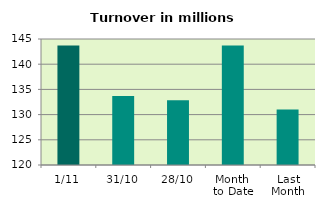
| Category | Series 0 |
|---|---|
| 1/11 | 143.712 |
| 31/10 | 133.702 |
| 28/10 | 132.831 |
| Month 
to Date | 143.712 |
| Last
Month | 131.017 |